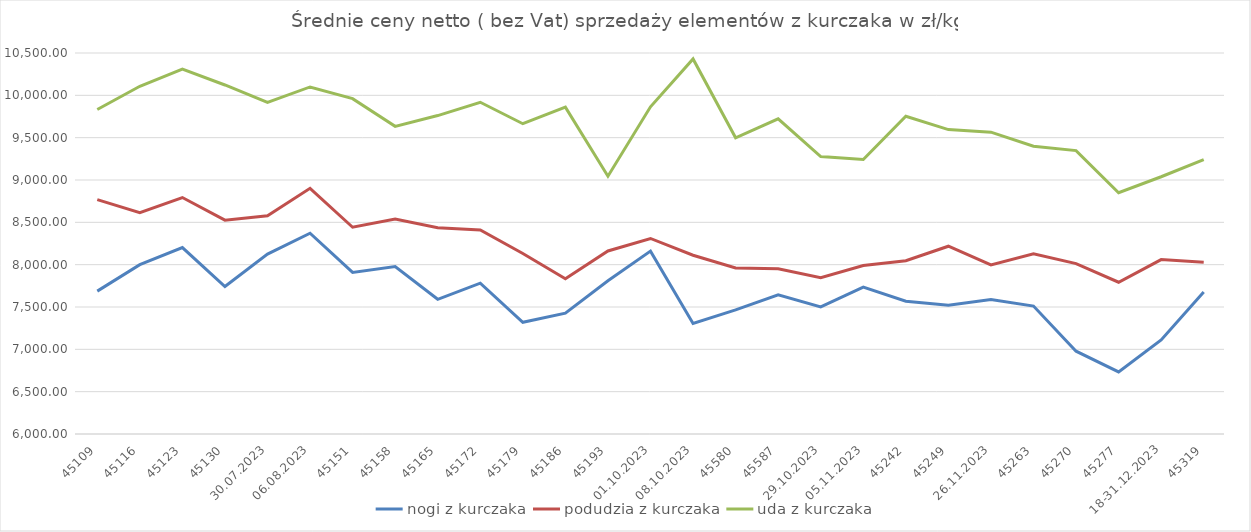
| Category | nogi z kurczaka | podudzia z kurczaka | uda z kurczaka |
|---|---|---|---|
| 02.07.2023 | 7687.764 | 8767.874 | 9832.741 |
| 09.07.2023 | 8000.765 | 8615.363 | 10107.134 |
| 16.07.2023 | 8202.484 | 8792.948 | 10308.766 |
| 23.07.2023 | 7741.784 | 8525.54 | 10122.365 |
| 30.07.2023 | 8124.135 | 8577.572 | 9916.046 |
| 06.08.2023 | 8371.089 | 8901.483 | 10099.026 |
| 13.08.2023 | 7908.93 | 8441.88 | 9960.938 |
| 20.08.2023 | 7977.673 | 8538.488 | 9633.407 |
| 27.08.2023 | 7591.035 | 8436.577 | 9761.022 |
| 03.09.2023 | 7781.4 | 8409.834 | 9918.171 |
| 10.09.2023 | 7319.093 | 8131.345 | 9664.676 |
| 17.09.2023 | 7426.536 | 7833.885 | 9860.94 |
| 24.09.2023 | 7810.658 | 8161.4 | 9044.93 |
| 01.10.2023 | 8159.885 | 8309.349 | 9864.299 |
| 08.10.2023 | 7304.61 | 8111.015 | 10429.635 |
| 15.10.2024 | 7465.615 | 7960.193 | 9498.775 |
| 22.10.2024 | 7644.261 | 7951.38 | 9722.368 |
| 29.10.2023 | 7502.097 | 7846.802 | 9276.48 |
| 05.11.2023 | 7734.254 | 7990.744 | 9242.552 |
| 12.11.2023 | 7568.014 | 8045.771 | 9752.325 |
| 19.11.2023 | 7519.413 | 8217.801 | 9595.177 |
| 26.11.2023 | 7589.366 | 7996.784 | 9564.96 |
| 03.12.2023 | 7511.298 | 8127.857 | 9398.148 |
| 10.12.2023 | 6978.434 | 8012.227 | 9347.307 |
| 17.12.2023 | 6733.418 | 7792.588 | 8849.856 |
| 18-31.12.2023 | 7111.394 | 8060.096 | 9038.483 |
| 28.01.2024 | 7676.285 | 8028.06 | 9240.609 |